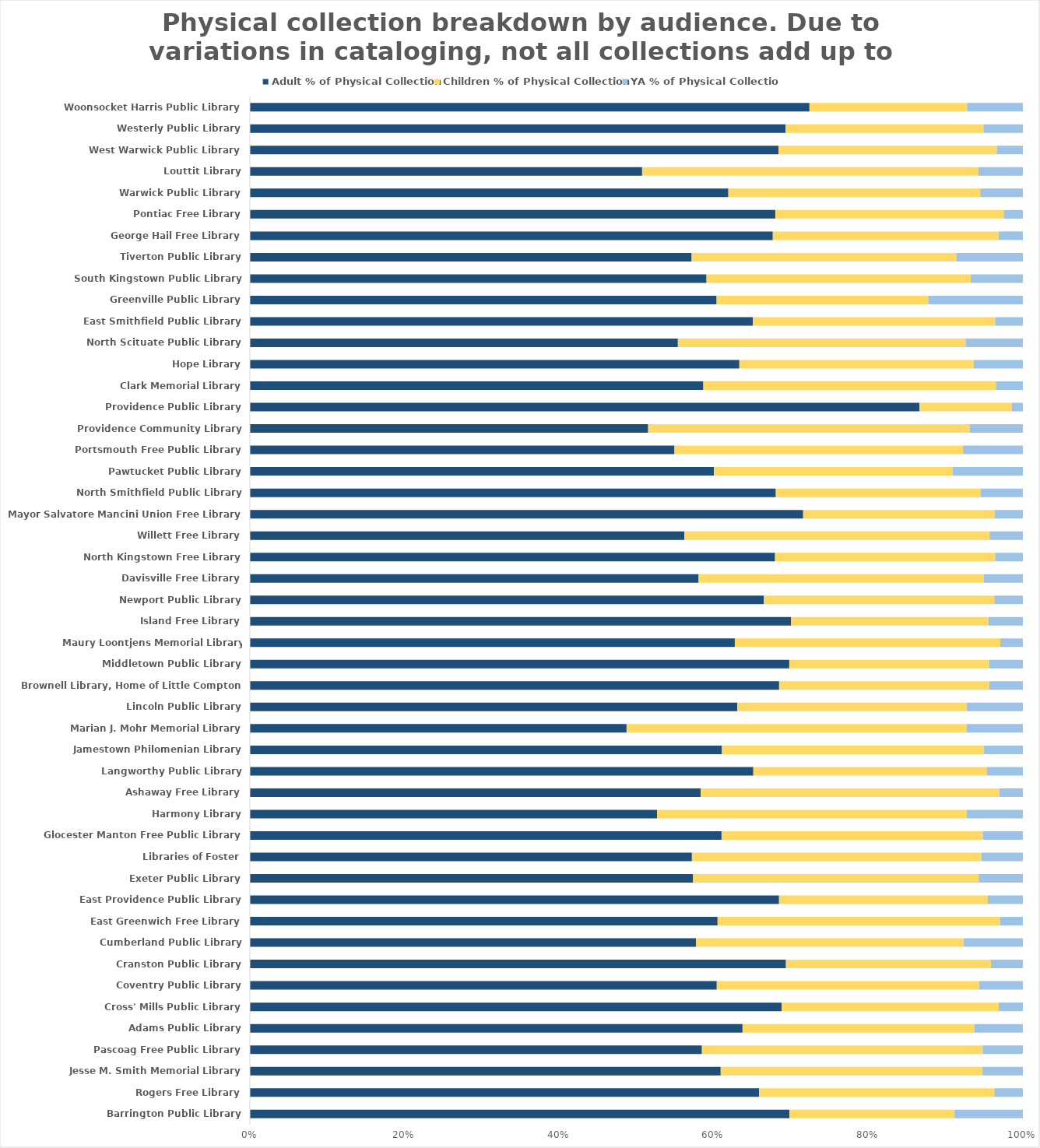
| Category | Adult % of Physical Collection | Children % of Physical Collection | YA % of Physical Collection |
|---|---|---|---|
| Barrington Public Library | 0.698 | 0.213 | 0.088 |
| Rogers Free Library | 0.659 | 0.304 | 0.037 |
| Jesse M. Smith Memorial Library | 0.609 | 0.339 | 0.052 |
| Pascoag Free Public Library | 0.583 | 0.362 | 0.052 |
| Adams Public Library | 0.637 | 0.3 | 0.063 |
| Cross' Mills Public Library | 0.688 | 0.281 | 0.031 |
| Coventry Public Library | 0.604 | 0.339 | 0.057 |
| Cranston Public Library | 0.642 | 0.246 | 0.038 |
| Cumberland Public Library | 0.577 | 0.346 | 0.077 |
| East Greenwich Free Library | 0.606 | 0.366 | 0.03 |
| East Providence Public Library | 0.685 | 0.27 | 0.045 |
| Exeter Public Library | 0.573 | 0.369 | 0.057 |
| Libraries of Foster | 0.572 | 0.374 | 0.054 |
| Glocester Manton Free Public Library | 0.61 | 0.338 | 0.052 |
| Harmony Library | 0.527 | 0.401 | 0.073 |
| Ashaway Free Library | 0.583 | 0.386 | 0.03 |
| Langworthy Public Library | 0.651 | 0.302 | 0.047 |
| Jamestown Philomenian Library | 0.604 | 0.335 | 0.05 |
| Marian J. Mohr Memorial Library | 0.487 | 0.44 | 0.073 |
| Lincoln Public Library | 0.631 | 0.297 | 0.072 |
| Brownell Library, Home of Little Compton | 0.683 | 0.271 | 0.043 |
| Middletown Public Library | 0.698 | 0.258 | 0.044 |
| Maury Loontjens Memorial Library (Narragansett) | 0.627 | 0.343 | 0.029 |
| Island Free Library | 0.7 | 0.255 | 0.044 |
| Newport Public Library | 0.664 | 0.298 | 0.037 |
| Davisville Free Library | 0.581 | 0.369 | 0.051 |
| North Kingstown Free Library | 0.67 | 0.281 | 0.035 |
| Willett Free Library | 0.562 | 0.395 | 0.043 |
| Mayor Salvatore Mancini Union Free Library | 0.716 | 0.248 | 0.036 |
| North Smithfield Public Library | 0.68 | 0.265 | 0.055 |
| Pawtucket Public Library | 0.6 | 0.309 | 0.091 |
| Portsmouth Free Public Library | 0.55 | 0.374 | 0.077 |
| Providence Community Library | 0.515 | 0.416 | 0.069 |
| Providence Public Library | 0.866 | 0.119 | 0.014 |
| Clark Memorial Library | 0.587 | 0.378 | 0.035 |
| Hope Library | 0.629 | 0.301 | 0.063 |
| North Scituate Public Library | 0.554 | 0.372 | 0.074 |
| East Smithfield Public Library | 0.651 | 0.314 | 0.036 |
| Greenville Public Library | 0.604 | 0.274 | 0.122 |
| South Kingstown Public Library | 0.589 | 0.341 | 0.067 |
| Tiverton Public Library | 0.572 | 0.342 | 0.086 |
| George Hail Free Library | 0.677 | 0.292 | 0.031 |
| Pontiac Free Library | 0.68 | 0.296 | 0.025 |
| Warwick Public Library | 0.619 | 0.326 | 0.055 |
| Louttit Library | 0.507 | 0.435 | 0.057 |
| West Warwick Public Library | 0.684 | 0.282 | 0.034 |
| Westerly Public Library | 0.693 | 0.256 | 0.051 |
| Woonsocket Harris Public Library | 0.724 | 0.204 | 0.072 |